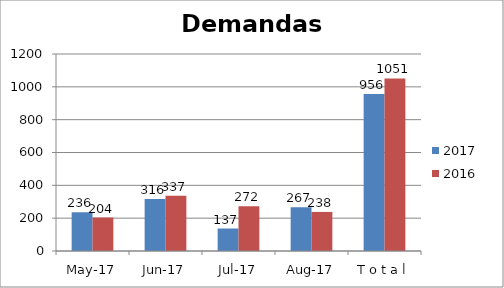
| Category | 2017 | 2016 |
|---|---|---|
| may-17 | 236 | 204 |
| jun-17 | 316 | 337 |
| jul-17 | 137 | 272 |
| ago-17 | 267 | 238 |
| T o t a l | 956 | 1051 |